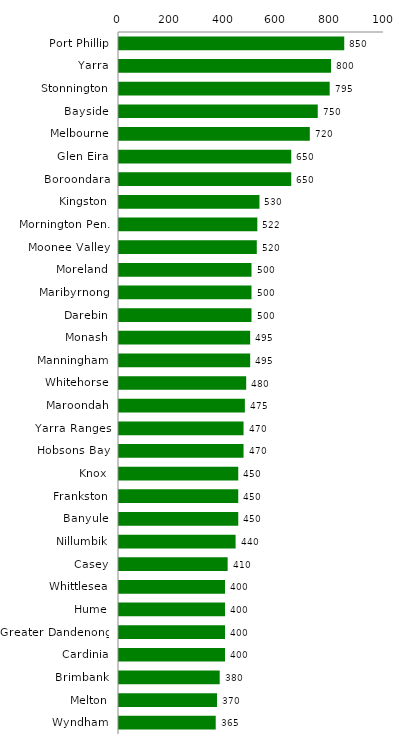
| Category | Series 0 |
|---|---|
| Port Phillip | 850 |
| Yarra | 800 |
| Stonnington | 795 |
| Bayside | 750 |
| Melbourne | 720 |
| Glen Eira | 650 |
| Boroondara | 650 |
| Kingston | 530 |
| Mornington Pen. | 522 |
| Moonee Valley | 520 |
| Moreland | 500 |
| Maribyrnong | 500 |
| Darebin | 500 |
| Monash | 495 |
| Manningham | 495 |
| Whitehorse | 480 |
| Maroondah | 475 |
| Yarra Ranges | 470 |
| Hobsons Bay | 470 |
| Knox | 450 |
| Frankston | 450 |
| Banyule | 450 |
| Nillumbik | 440 |
| Casey | 410 |
| Whittlesea | 400 |
| Hume | 400 |
| Greater Dandenong | 400 |
| Cardinia | 400 |
| Brimbank | 380 |
| Melton | 370 |
| Wyndham | 365 |